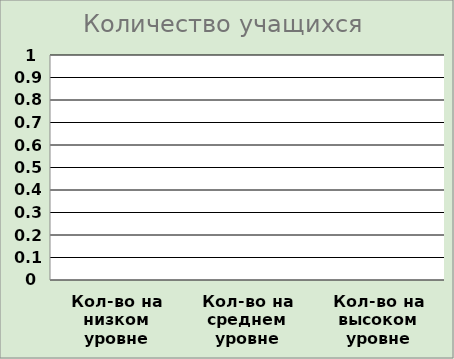
| Category | Series 0 | Series 1 |
|---|---|---|
| Кол-во на низком уровне |  | 0 |
| Кол-во на среднем уровне |  | 0 |
| Кол-во на высоком уровне |  | 0 |